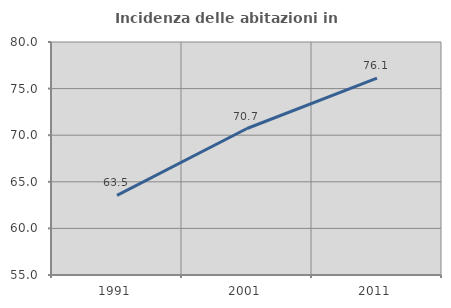
| Category | Incidenza delle abitazioni in proprietà  |
|---|---|
| 1991.0 | 63.538 |
| 2001.0 | 70.717 |
| 2011.0 | 76.119 |